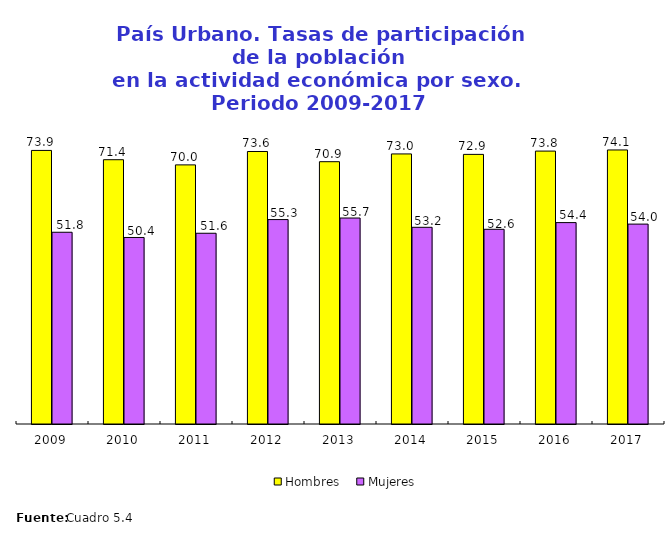
| Category | Hombres | Mujeres |
|---|---|---|
| 2009.0 | 73.936 | 51.821 |
| 2010.0 | 71.431 | 50.41 |
| 2011.0 | 70.033 | 51.553 |
| 2012.0 | 73.649 | 55.252 |
| 2013.0 | 70.893 | 55.669 |
| 2014.0 | 72.993 | 53.161 |
| 2015.0 | 72.87 | 52.626 |
| 2016.0 | 73.762 | 54.434 |
| 2017.0 | 74.063 | 54.027 |